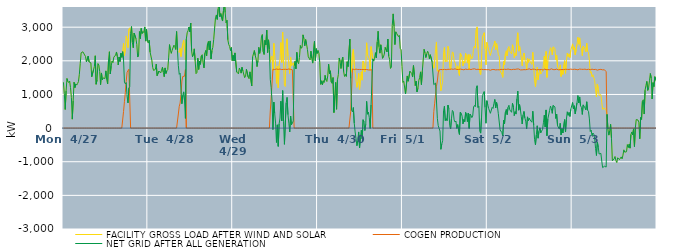
| Category | FACILITY GROSS LOAD AFTER WIND AND SOLAR | COGEN PRODUCTION | NET GRID AFTER ALL GENERATION |
|---|---|---|---|
|  Mon  4/27 | 1361 | 0 | 1361 |
|  Mon  4/27 | 1023 | 0 | 1023 |
|  Mon  4/27 | 554 | 0 | 554 |
|  Mon  4/27 | 1106 | 0 | 1106 |
|  Mon  4/27 | 1473 | 0 | 1473 |
|  Mon  4/27 | 1386 | 0 | 1386 |
|  Mon  4/27 | 1354 | 0 | 1354 |
|  Mon  4/27 | 1400 | 0 | 1400 |
|  Mon  4/27 | 1206 | 0 | 1206 |
|  Mon  4/27 | 909 | 0 | 909 |
|  Mon  4/27 | 266 | 0 | 266 |
|  Mon  4/27 | 810 | 0 | 810 |
|  Mon  4/27 | 1363 | 0 | 1363 |
|  Mon  4/27 | 1203 | 0 | 1203 |
|  Mon  4/27 | 1314 | 0 | 1314 |
|  Mon  4/27 | 1278 | 0 | 1278 |
|  Mon  4/27 | 1325 | 0 | 1325 |
|  Mon  4/27 | 1386 | 0 | 1386 |
|  Mon  4/27 | 1600 | 0 | 1600 |
|  Mon  4/27 | 1918 | 0 | 1918 |
|  Mon  4/27 | 2237 | 0 | 2237 |
|  Mon  4/27 | 2208 | 0 | 2208 |
|  Mon  4/27 | 2268 | 0 | 2268 |
|  Mon  4/27 | 2263 | 0 | 2263 |
|  Mon  4/27 | 2173 | 0 | 2173 |
|  Mon  4/27 | 2127 | 0 | 2127 |
|  Mon  4/27 | 1969 | 0 | 1969 |
|  Mon  4/27 | 1982 | 0 | 1982 |
|  Mon  4/27 | 2140 | 0 | 2140 |
|  Mon  4/27 | 1966 | 0 | 1966 |
|  Mon  4/27 | 1949 | 0 | 1949 |
|  Mon  4/27 | 1941 | 0 | 1941 |
|  Mon  4/27 | 1524 | 0 | 1524 |
|  Mon  4/27 | 1505 | 0 | 1505 |
|  Mon  4/27 | 1728 | 0 | 1728 |
|  Mon  4/27 | 1834 | 0 | 1834 |
|  Mon  4/27 | 2150 | 0 | 2150 |
|  Mon  4/27 | 1303 | 0 | 1303 |
|  Mon  4/27 | 1428 | 0 | 1428 |
|  Mon  4/27 | 1918 | 0 | 1918 |
|  Mon  4/27 | 1874 | 0 | 1874 |
|  Mon  4/27 | 1685 | 0 | 1685 |
|  Mon  4/27 | 1290 | 0 | 1290 |
|  Mon  4/27 | 1639 | 0 | 1639 |
|  Mon  4/27 | 1435 | 0 | 1435 |
|  Mon  4/27 | 1491 | 0 | 1491 |
|  Mon  4/27 | 1464 | 0 | 1464 |
|  Mon  4/27 | 1474 | 0 | 1474 |
|  Mon  4/27 | 1701 | 0 | 1701 |
|  Mon  4/27 | 1441 | 0 | 1441 |
|  Mon  4/27 | 1311 | 0 | 1311 |
|  Mon  4/27 | 2016 | 0 | 2016 |
|  Mon  4/27 | 2270 | 0 | 2270 |
|  Mon  4/27 | 1611 | 0 | 1611 |
|  Mon  4/27 | 1842 | 0 | 1842 |
|  Mon  4/27 | 1997 | 0 | 1997 |
|  Mon  4/27 | 1945 | 0 | 1945 |
|  Mon  4/27 | 2108 | 0 | 2108 |
|  Mon  4/27 | 2132 | 0 | 2132 |
|  Mon  4/27 | 2171 | 0 | 2171 |
|  Mon  4/27 | 2263 | 0 | 2263 |
|  Mon  4/27 | 2124 | 0 | 2124 |
|  Mon  4/27 | 1877 | 0 | 1877 |
|  Mon  4/27 | 2114 | 0 | 2114 |
|  Mon  4/27 | 1979 | 0 | 1979 |
|  Mon  4/27 | 2227 | 0 | 2227 |
|  Mon  4/27 | 2104 | 0 | 2104 |
|  Mon  4/27 | 2271 | 0 | 2271 |
|  Mon  4/27 | 2520 | 494 | 2026 |
|  Mon  4/27 | 2155 | 784 | 1371 |
|  Mon  4/27 | 2367 | 1052 | 1315 |
|  Mon  4/27 | 2740 | 1388 | 1352 |
|  Mon  4/27 | 2609 | 1658 | 951 |
|  Mon  4/27 | 2392 | 1642 | 750 |
|  Mon  4/27 | 2936 | 1749 | 1187 |
|  Mon  4/27 | 2981 | 1747 | 1234 |
|  Mon  4/27 | 2820 | 0 | 2820 |
|  Mon  4/27 | 3019 | 0 | 3019 |
|  Mon  4/27 | 2544 | 0 | 2544 |
|  Mon  4/27 | 2389 | 0 | 2389 |
|  Mon  4/27 | 2825 | 0 | 2825 |
|  Mon  4/27 | 2824 | 0 | 2824 |
|  Mon  4/27 | 2659 | 0 | 2659 |
|  Mon  4/27 | 2485 | 0 | 2485 |
|  Mon  4/27 | 2113 | 0 | 2113 |
|  Mon  4/27 | 2169 | 0 | 2169 |
|  Mon  4/27 | 2870 | 0 | 2870 |
|  Mon  4/27 | 2660 | 0 | 2660 |
|  Mon  4/27 | 2964 | 0 | 2964 |
|  Mon  4/27 | 2810 | 0 | 2810 |
|  Mon  4/27 | 2870 | 0 | 2870 |
|  Mon  4/27 | 2840 | 0 | 2840 |
|  Mon  4/27 | 3007 | 0 | 3007 |
|  Mon  4/27 | 2586 | 0 | 2586 |
|  Mon  4/27 | 2938 | 0 | 2938 |
|  Mon  4/27 | 2580 | 0 | 2580 |
|  Tue  4/28 | 2531 | 0 | 2531 |
|  Tue  4/28 | 2614 | 0 | 2614 |
|  Tue  4/28 | 2262 | 0 | 2262 |
|  Tue  4/28 | 2263 | 0 | 2263 |
|  Tue  4/28 | 2017 | 0 | 2017 |
|  Tue  4/28 | 1799 | 0 | 1799 |
|  Tue  4/28 | 1714 | 0 | 1714 |
|  Tue  4/28 | 1735 | 0 | 1735 |
|  Tue  4/28 | 1745 | 0 | 1745 |
|  Tue  4/28 | 1901 | 0 | 1901 |
|  Tue  4/28 | 1558 | 0 | 1558 |
|  Tue  4/28 | 1535 | 0 | 1535 |
|  Tue  4/28 | 1697 | 0 | 1697 |
|  Tue  4/28 | 1707 | 0 | 1707 |
|  Tue  4/28 | 1638 | 0 | 1638 |
|  Tue  4/28 | 1722 | 0 | 1722 |
|  Tue  4/28 | 1810 | 0 | 1810 |
|  Tue  4/28 | 1660 | 0 | 1660 |
|  Tue  4/28 | 1528 | 0 | 1528 |
|  Tue  4/28 | 1789 | 0 | 1789 |
|  Tue  4/28 | 1623 | 0 | 1623 |
|  Tue  4/28 | 1706 | 0 | 1706 |
|  Tue  4/28 | 1740 | 0 | 1740 |
|  Tue  4/28 | 2086 | 0 | 2086 |
|  Tue  4/28 | 2481 | 0 | 2481 |
|  Tue  4/28 | 2316 | 0 | 2316 |
|  Tue  4/28 | 2221 | 0 | 2221 |
|  Tue  4/28 | 2317 | 0 | 2317 |
|  Tue  4/28 | 2310 | 0 | 2310 |
|  Tue  4/28 | 2465 | 0 | 2465 |
|  Tue  4/28 | 2420 | 0 | 2420 |
|  Tue  4/28 | 2338 | 0 | 2338 |
|  Tue  4/28 | 2870 | 0 | 2870 |
|  Tue  4/28 | 2309 | 0 | 2309 |
|  Tue  4/28 | 2276 | 419 | 1857 |
|  Tue  4/28 | 2246 | 647 | 1599 |
|  Tue  4/28 | 2372 | 742 | 1630 |
|  Tue  4/28 | 2126 | 997 | 1129 |
|  Tue  4/28 | 2122 | 1399 | 723 |
|  Tue  4/28 | 2510 | 1534 | 976 |
|  Tue  4/28 | 2614 | 1537 | 1077 |
|  Tue  4/28 | 2356 | 1544 | 812 |
|  Tue  4/28 | 2028 | 1739 | 289 |
|  Tue  4/28 | 2643 | 0 | 2643 |
|  Tue  4/28 | 2834 | 0 | 2834 |
|  Tue  4/28 | 2895 | 0 | 2895 |
|  Tue  4/28 | 3005 | 0 | 3005 |
|  Tue  4/28 | 2859 | 0 | 2859 |
|  Tue  4/28 | 3123 | 0 | 3123 |
|  Tue  4/28 | 2298 | 0 | 2298 |
|  Tue  4/28 | 2121 | 0 | 2121 |
|  Tue  4/28 | 2200 | 0 | 2200 |
|  Tue  4/28 | 2356 | 0 | 2356 |
|  Tue  4/28 | 2010 | 0 | 2010 |
|  Tue  4/28 | 1619 | 0 | 1619 |
|  Tue  4/28 | 1654 | 0 | 1654 |
|  Tue  4/28 | 2079 | 0 | 2079 |
|  Tue  4/28 | 1743 | 0 | 1743 |
|  Tue  4/28 | 1989 | 0 | 1989 |
|  Tue  4/28 | 1896 | 0 | 1896 |
|  Tue  4/28 | 2145 | 0 | 2145 |
|  Tue  4/28 | 2182 | 0 | 2182 |
|  Tue  4/28 | 1942 | 0 | 1942 |
|  Tue  4/28 | 1790 | 0 | 1790 |
|  Tue  4/28 | 2224 | 0 | 2224 |
|  Tue  4/28 | 2307 | 0 | 2307 |
|  Tue  4/28 | 2151 | 0 | 2151 |
|  Tue  4/28 | 2503 | 0 | 2503 |
|  Tue  4/28 | 2577 | 0 | 2577 |
|  Tue  4/28 | 2323 | 0 | 2323 |
|  Tue  4/28 | 2591 | 0 | 2591 |
|  Tue  4/28 | 2057 | 0 | 2057 |
|  Tue  4/28 | 2301 | 0 | 2301 |
|  Tue  4/28 | 2400 | 0 | 2400 |
|  Tue  4/28 | 2639 | 0 | 2639 |
|  Tue  4/28 | 2645 | 0 | 2645 |
|  Tue  4/28 | 3277 | 0 | 3277 |
|  Tue  4/28 | 3364 | 0 | 3364 |
|  Tue  4/28 | 3231 | 0 | 3231 |
|  Tue  4/28 | 3536 | 0 | 3536 |
|  Tue  4/28 | 3761 | 0 | 3761 |
|  Tue  4/28 | 3311 | 0 | 3311 |
|  Tue  4/28 | 3404 | 0 | 3404 |
|  Tue  4/28 | 3402 | 0 | 3402 |
|  Tue  4/28 | 3183 | 0 | 3183 |
|  Tue  4/28 | 3483 | 0 | 3483 |
|  Tue  4/28 | 3815 | 0 | 3815 |
|  Tue  4/28 | 3434 | 0 | 3434 |
|  Tue  4/28 | 3133 | 0 | 3133 |
|  Tue  4/28 | 3203 | 0 | 3203 |
|  Tue  4/28 | 2625 | 0 | 2625 |
|  Tue  4/28 | 2484 | 0 | 2484 |
|  Tue  4/28 | 2431 | 0 | 2431 |
|  Tue  4/28 | 2305 | 0 | 2305 |
|  Tue  4/28 | 2394 | 0 | 2394 |
|  Tue  4/28 | 2009 | 0 | 2009 |
|  Wed  4/29 | 2164 | 0 | 2164 |
|  Wed  4/29 | 1997 | 0 | 1997 |
|  Wed  4/29 | 2235 | 0 | 2235 |
|  Wed  4/29 | 2218 | 0 | 2218 |
|  Wed  4/29 | 1667 | 0 | 1667 |
|  Wed  4/29 | 1671 | 0 | 1671 |
|  Wed  4/29 | 1613 | 0 | 1613 |
|  Wed  4/29 | 1783 | 0 | 1783 |
|  Wed  4/29 | 1735 | 0 | 1735 |
|  Wed  4/29 | 1634 | 0 | 1634 |
|  Wed  4/29 | 1808 | 0 | 1808 |
|  Wed  4/29 | 1701 | 0 | 1701 |
|  Wed  4/29 | 1710 | 0 | 1710 |
|  Wed  4/29 | 1500 | 0 | 1500 |
|  Wed  4/29 | 1533 | 0 | 1533 |
|  Wed  4/29 | 1747 | 0 | 1747 |
|  Wed  4/29 | 1760 | 0 | 1760 |
|  Wed  4/29 | 1517 | 0 | 1517 |
|  Wed  4/29 | 1469 | 0 | 1469 |
|  Wed  4/29 | 1672 | 0 | 1672 |
|  Wed  4/29 | 1669 | 0 | 1669 |
|  Wed  4/29 | 1255 | 0 | 1255 |
|  Wed  4/29 | 2115 | 0 | 2115 |
|  Wed  4/29 | 2108 | 0 | 2108 |
|  Wed  4/29 | 2305 | 0 | 2305 |
|  Wed  4/29 | 2157 | 0 | 2157 |
|  Wed  4/29 | 2053 | 0 | 2053 |
|  Wed  4/29 | 1829 | 0 | 1829 |
|  Wed  4/29 | 1999 | 0 | 1999 |
|  Wed  4/29 | 2401 | 0 | 2401 |
|  Wed  4/29 | 2222 | 0 | 2222 |
|  Wed  4/29 | 2373 | 0 | 2373 |
|  Wed  4/29 | 2708 | 0 | 2708 |
|  Wed  4/29 | 2779 | 0 | 2779 |
|  Wed  4/29 | 2271 | 0 | 2271 |
|  Wed  4/29 | 2189 | 0 | 2189 |
|  Wed  4/29 | 2609 | 0 | 2609 |
|  Wed  4/29 | 2477 | 0 | 2477 |
|  Wed  4/29 | 2912 | 0 | 2912 |
|  Wed  4/29 | 2246 | 0 | 2246 |
|  Wed  4/29 | 2624 | 0 | 2624 |
|  Wed  4/29 | 2344 | 0 | 2344 |
|  Wed  4/29 | 1954 | 508 | 1446 |
|  Wed  4/29 | 2097 | 894 | 1203 |
|  Wed  4/29 | 2145 | 1338 | 807 |
|  Wed  4/29 | 1706 | 1749 | -43 |
|  Wed  4/29 | 2517 | 1744 | 773 |
|  Wed  4/29 | 2175 | 1741 | 434 |
|  Wed  4/29 | 1904 | 1755 | 149 |
|  Wed  4/29 | 1330 | 1757 | -427 |
|  Wed  4/29 | 1839 | 1742 | 97 |
|  Wed  4/29 | 1200 | 1744 | -544 |
|  Wed  4/29 | 1864 | 1740 | 124 |
|  Wed  4/29 | 2056 | 1756 | 300 |
|  Wed  4/29 | 2542 | 1742 | 800 |
|  Wed  4/29 | 1951 | 1739 | 212 |
|  Wed  4/29 | 2852 | 1737 | 1115 |
|  Wed  4/29 | 1944 | 1746 | 198 |
|  Wed  4/29 | 1269 | 1752 | -483 |
|  Wed  4/29 | 1236 | 1748 | -512 |
|  Wed  4/29 | 2489 | 1738 | 751 |
|  Wed  4/29 | 2655 | 1743 | 912 |
|  Wed  4/29 | 2136 | 1739 | 397 |
|  Wed  4/29 | 1903 | 1757 | 146 |
|  Wed  4/29 | 1620 | 1735 | -115 |
|  Wed  4/29 | 2103 | 1745 | 358 |
|  Wed  4/29 | 1848 | 1748 | 100 |
|  Wed  4/29 | 1876 | 1734 | 142 |
|  Wed  4/29 | 1943 | 1728 | 215 |
|  Wed  4/29 | 1833 | 0 | 1833 |
|  Wed  4/29 | 1984 | 0 | 1984 |
|  Wed  4/29 | 1762 | 0 | 1762 |
|  Wed  4/29 | 2251 | 0 | 2251 |
|  Wed  4/29 | 1971 | 0 | 1971 |
|  Wed  4/29 | 1913 | 0 | 1913 |
|  Wed  4/29 | 2099 | 0 | 2099 |
|  Wed  4/29 | 2454 | 0 | 2454 |
|  Wed  4/29 | 2374 | 0 | 2374 |
|  Wed  4/29 | 2404 | 0 | 2404 |
|  Wed  4/29 | 2772 | 0 | 2772 |
|  Wed  4/29 | 2661 | 0 | 2661 |
|  Wed  4/29 | 2446 | 0 | 2446 |
|  Wed  4/29 | 2631 | 0 | 2631 |
|  Wed  4/29 | 2502 | 0 | 2502 |
|  Wed  4/29 | 2341 | 0 | 2341 |
|  Wed  4/29 | 2119 | 0 | 2119 |
|  Wed  4/29 | 2074 | 0 | 2074 |
|  Wed  4/29 | 2029 | 0 | 2029 |
|  Wed  4/29 | 2286 | 0 | 2286 |
|  Wed  4/29 | 2072 | 0 | 2072 |
|  Wed  4/29 | 1932 | 0 | 1932 |
|  Wed  4/29 | 1929 | 0 | 1929 |
|  Wed  4/29 | 2578 | 0 | 2578 |
|  Wed  4/29 | 2004 | 0 | 2004 |
|  Wed  4/29 | 2362 | 0 | 2362 |
|  Wed  4/29 | 2219 | 0 | 2219 |
|  Thu  4/30 | 2305 | 0 | 2305 |
|  Thu  4/30 | 2226 | 0 | 2226 |
|  Thu  4/30 | 1942 | 0 | 1942 |
|  Thu  4/30 | 1301 | 0 | 1301 |
|  Thu  4/30 | 1405 | 0 | 1405 |
|  Thu  4/30 | 1288 | 0 | 1288 |
|  Thu  4/30 | 1407 | 0 | 1407 |
|  Thu  4/30 | 1358 | 0 | 1358 |
|  Thu  4/30 | 1568 | 0 | 1568 |
|  Thu  4/30 | 1429 | 0 | 1429 |
|  Thu  4/30 | 1386 | 0 | 1386 |
|  Thu  4/30 | 1550 | 0 | 1550 |
|  Thu  4/30 | 1901 | 0 | 1901 |
|  Thu  4/30 | 1611 | 0 | 1611 |
|  Thu  4/30 | 1703 | 0 | 1703 |
|  Thu  4/30 | 1367 | 0 | 1367 |
|  Thu  4/30 | 1327 | 0 | 1327 |
|  Thu  4/30 | 1504 | 0 | 1504 |
|  Thu  4/30 | 462 | 0 | 462 |
|  Thu  4/30 | 978 | 0 | 978 |
|  Thu  4/30 | 1358 | 0 | 1358 |
|  Thu  4/30 | 560 | 0 | 560 |
|  Thu  4/30 | 1444 | 0 | 1444 |
|  Thu  4/30 | 1591 | 0 | 1591 |
|  Thu  4/30 | 2084 | 0 | 2084 |
|  Thu  4/30 | 1979 | 0 | 1979 |
|  Thu  4/30 | 1772 | 0 | 1772 |
|  Thu  4/30 | 2015 | 0 | 2015 |
|  Thu  4/30 | 2112 | 0 | 2112 |
|  Thu  4/30 | 1677 | 0 | 1677 |
|  Thu  4/30 | 1535 | 0 | 1535 |
|  Thu  4/30 | 1598 | 0 | 1598 |
|  Thu  4/30 | 1537 | 0 | 1537 |
|  Thu  4/30 | 1971 | 0 | 1971 |
|  Thu  4/30 | 1829 | 0 | 1829 |
|  Thu  4/30 | 1826 | 0 | 1826 |
|  Thu  4/30 | 2645 | 0 | 2645 |
|  Thu  4/30 | 1970 | 499 | 1471 |
|  Thu  4/30 | 1664 | 1132 | 532 |
|  Thu  4/30 | 2243 | 1760 | 483 |
|  Thu  4/30 | 2347 | 1736 | 611 |
|  Thu  4/30 | 1883 | 1739 | 144 |
|  Thu  4/30 | 1638 | 1751 | -113 |
|  Thu  4/30 | 1658 | 1754 | -96 |
|  Thu  4/30 | 1211 | 1735 | -524 |
|  Thu  4/30 | 1369 | 1742 | -373 |
|  Thu  4/30 | 1625 | 1739 | -114 |
|  Thu  4/30 | 1152 | 1743 | -591 |
|  Thu  4/30 | 1472 | 1746 | -274 |
|  Thu  4/30 | 1675 | 1741 | -66 |
|  Thu  4/30 | 1424 | 1743 | -319 |
|  Thu  4/30 | 1989 | 1741 | 248 |
|  Thu  4/30 | 1900 | 1714 | 186 |
|  Thu  4/30 | 1669 | 1741 | -72 |
|  Thu  4/30 | 1853 | 1738 | 115 |
|  Thu  4/30 | 2536 | 1742 | 794 |
|  Thu  4/30 | 2173 | 1760 | 413 |
|  Thu  4/30 | 2201 | 1730 | 471 |
|  Thu  4/30 | 2061 | 1753 | 308 |
|  Thu  4/30 | 1718 | 1728 | -10 |
|  Thu  4/30 | 2422 | 1733 | 689 |
|  Thu  4/30 | 2404 | 1734 | 670 |
|  Thu  4/30 | 2059 | 0 | 2059 |
|  Thu  4/30 | 1991 | 0 | 1991 |
|  Thu  4/30 | 2073 | 0 | 2073 |
|  Thu  4/30 | 2242 | 0 | 2242 |
|  Thu  4/30 | 2089 | 0 | 2089 |
|  Thu  4/30 | 2564 | 0 | 2564 |
|  Thu  4/30 | 2879 | 0 | 2879 |
|  Thu  4/30 | 2416 | 0 | 2416 |
|  Thu  4/30 | 2228 | 0 | 2228 |
|  Thu  4/30 | 2476 | 0 | 2476 |
|  Thu  4/30 | 2312 | 0 | 2312 |
|  Thu  4/30 | 2072 | 0 | 2072 |
|  Thu  4/30 | 2116 | 0 | 2116 |
|  Thu  4/30 | 2199 | 0 | 2199 |
|  Thu  4/30 | 2399 | 0 | 2399 |
|  Thu  4/30 | 2401 | 0 | 2401 |
|  Thu  4/30 | 2269 | 0 | 2269 |
|  Thu  4/30 | 2646 | 0 | 2646 |
|  Thu  4/30 | 2137 | 0 | 2137 |
|  Thu  4/30 | 2044 | 0 | 2044 |
|  Thu  4/30 | 1773 | 0 | 1773 |
|  Thu  4/30 | 1815 | 0 | 1815 |
|  Thu  4/30 | 3052 | 0 | 3052 |
|  Thu  4/30 | 3395 | 0 | 3395 |
|  Thu  4/30 | 3036 | 0 | 3036 |
|  Thu  4/30 | 2483 | 0 | 2483 |
|  Thu  4/30 | 2862 | 0 | 2862 |
|  Thu  4/30 | 2813 | 0 | 2813 |
|  Thu  4/30 | 2833 | 0 | 2833 |
|  Thu  4/30 | 2720 | 0 | 2720 |
|  Thu  4/30 | 2756 | 0 | 2756 |
|  Thu  4/30 | 2370 | 0 | 2370 |
|  Thu  4/30 | 2327 | 0 | 2327 |
|  Thu  4/30 | 1832 | 0 | 1832 |
|  Fri  5/1 | 1360 | 0 | 1360 |
|  Fri  5/1 | 1393 | 0 | 1393 |
|  Fri  5/1 | 1415 | 0 | 1415 |
|  Fri  5/1 | 1017 | 0 | 1017 |
|  Fri  5/1 | 995 | 0 | 995 |
|  Fri  5/1 | 1550 | 0 | 1550 |
|  Fri  5/1 | 1393 | 0 | 1393 |
|  Fri  5/1 | 1417 | 0 | 1417 |
|  Fri  5/1 | 1689 | 0 | 1689 |
|  Fri  5/1 | 1659 | 0 | 1659 |
|  Fri  5/1 | 1623 | 0 | 1623 |
|  Fri  5/1 | 1518 | 0 | 1518 |
|  Fri  5/1 | 1859 | 0 | 1859 |
|  Fri  5/1 | 1583 | 0 | 1583 |
|  Fri  5/1 | 1264 | 0 | 1264 |
|  Fri  5/1 | 1395 | 0 | 1395 |
|  Fri  5/1 | 1077 | 0 | 1077 |
|  Fri  5/1 | 1179 | 0 | 1179 |
|  Fri  5/1 | 1415 | 0 | 1415 |
|  Fri  5/1 | 1502 | 0 | 1502 |
|  Fri  5/1 | 1671 | 0 | 1671 |
|  Fri  5/1 | 1293 | 0 | 1293 |
|  Fri  5/1 | 1689 | 0 | 1689 |
|  Fri  5/1 | 2023 | 0 | 2023 |
|  Fri  5/1 | 2341 | 0 | 2341 |
|  Fri  5/1 | 2236 | 0 | 2236 |
|  Fri  5/1 | 2098 | 0 | 2098 |
|  Fri  5/1 | 2205 | 0 | 2205 |
|  Fri  5/1 | 2284 | 0 | 2284 |
|  Fri  5/1 | 2223 | 0 | 2223 |
|  Fri  5/1 | 2062 | 0 | 2062 |
|  Fri  5/1 | 2180 | 0 | 2180 |
|  Fri  5/1 | 2181 | 0 | 2181 |
|  Fri  5/1 | 1973 | 0 | 1973 |
|  Fri  5/1 | 1995 | 0 | 1995 |
|  Fri  5/1 | 1782 | 490 | 1292 |
|  Fri  5/1 | 2040 | 740 | 1300 |
|  Fri  5/1 | 2334 | 996 | 1338 |
|  Fri  5/1 | 2560 | 1245 | 1315 |
|  Fri  5/1 | 1691 | 1401 | 290 |
|  Fri  5/1 | 1714 | 1640 | 74 |
|  Fri  5/1 | 1721 | 1731 | -10 |
|  Fri  5/1 | 1652 | 1740 | -88 |
|  Fri  5/1 | 1112 | 1743 | -631 |
|  Fri  5/1 | 1261 | 1738 | -477 |
|  Fri  5/1 | 1365 | 1738 | -373 |
|  Fri  5/1 | 2250 | 1739 | 511 |
|  Fri  5/1 | 2395 | 1746 | 649 |
|  Fri  5/1 | 1964 | 1740 | 224 |
|  Fri  5/1 | 2016 | 1737 | 279 |
|  Fri  5/1 | 1972 | 1752 | 220 |
|  Fri  5/1 | 2432 | 1748 | 684 |
|  Fri  5/1 | 2327 | 1747 | 580 |
|  Fri  5/1 | 1816 | 1746 | 70 |
|  Fri  5/1 | 1728 | 1754 | -26 |
|  Fri  5/1 | 2044 | 1756 | 288 |
|  Fri  5/1 | 2266 | 1741 | 525 |
|  Fri  5/1 | 2236 | 1747 | 489 |
|  Fri  5/1 | 1994 | 1751 | 243 |
|  Fri  5/1 | 1941 | 1761 | 180 |
|  Fri  5/1 | 1945 | 1735 | 210 |
|  Fri  5/1 | 1734 | 1743 | -9 |
|  Fri  5/1 | 1850 | 1747 | 103 |
|  Fri  5/1 | 1846 | 1742 | 104 |
|  Fri  5/1 | 1565 | 1754 | -189 |
|  Fri  5/1 | 2228 | 1754 | 474 |
|  Fri  5/1 | 2186 | 1742 | 444 |
|  Fri  5/1 | 2096 | 1743 | 353 |
|  Fri  5/1 | 1849 | 1723 | 126 |
|  Fri  5/1 | 1992 | 1733 | 259 |
|  Fri  5/1 | 1930 | 1744 | 186 |
|  Fri  5/1 | 2218 | 1754 | 464 |
|  Fri  5/1 | 2131 | 1737 | 394 |
|  Fri  5/1 | 1933 | 1741 | 192 |
|  Fri  5/1 | 2183 | 1738 | 445 |
|  Fri  5/1 | 1743 | 1754 | -11 |
|  Fri  5/1 | 2184 | 1765 | 419 |
|  Fri  5/1 | 2121 | 1740 | 381 |
|  Fri  5/1 | 2061 | 1750 | 311 |
|  Fri  5/1 | 2116 | 1756 | 360 |
|  Fri  5/1 | 2372 | 1745 | 627 |
|  Fri  5/1 | 2436 | 1763 | 673 |
|  Fri  5/1 | 2376 | 1740 | 636 |
|  Fri  5/1 | 2917 | 1742 | 1175 |
|  Fri  5/1 | 3009 | 1750 | 1259 |
|  Fri  5/1 | 2363 | 1750 | 613 |
|  Fri  5/1 | 2378 | 1731 | 647 |
|  Fri  5/1 | 1649 | 1740 | -91 |
|  Fri  5/1 | 1590 | 1740 | -150 |
|  Fri  5/1 | 2071 | 1749 | 322 |
|  Fri  5/1 | 2711 | 1743 | 968 |
|  Fri  5/1 | 2699 | 1739 | 960 |
|  Fri  5/1 | 2836 | 1751 | 1085 |
|  Fri  5/1 | 2354 | 1741 | 613 |
|  Fri  5/1 | 1879 | 1735 | 144 |
|  Fri  5/1 | 2549 | 1735 | 814 |
|  Sat  5/2 | 2442 | 1746 | 696 |
|  Sat  5/2 | 2326 | 1739 | 587 |
|  Sat  5/2 | 2321 | 1740 | 581 |
|  Sat  5/2 | 2159 | 1720 | 439 |
|  Sat  5/2 | 2180 | 1746 | 434 |
|  Sat  5/2 | 2357 | 1741 | 616 |
|  Sat  5/2 | 2349 | 1764 | 585 |
|  Sat  5/2 | 2474 | 1742 | 732 |
|  Sat  5/2 | 2590 | 1739 | 851 |
|  Sat  5/2 | 2329 | 1730 | 599 |
|  Sat  5/2 | 2512 | 1748 | 764 |
|  Sat  5/2 | 2370 | 1735 | 635 |
|  Sat  5/2 | 2178 | 1751 | 427 |
|  Sat  5/2 | 2136 | 1733 | 403 |
|  Sat  5/2 | 1703 | 1759 | -56 |
|  Sat  5/2 | 1703 | 1747 | -44 |
|  Sat  5/2 | 1605 | 1738 | -133 |
|  Sat  5/2 | 1508 | 1741 | -233 |
|  Sat  5/2 | 1983 | 1751 | 232 |
|  Sat  5/2 | 1875 | 1748 | 127 |
|  Sat  5/2 | 2218 | 1743 | 475 |
|  Sat  5/2 | 2298 | 1744 | 554 |
|  Sat  5/2 | 2144 | 1744 | 400 |
|  Sat  5/2 | 2370 | 1755 | 615 |
|  Sat  5/2 | 2426 | 1747 | 679 |
|  Sat  5/2 | 2282 | 1742 | 540 |
|  Sat  5/2 | 2281 | 1752 | 529 |
|  Sat  5/2 | 2207 | 1737 | 470 |
|  Sat  5/2 | 2478 | 1740 | 738 |
|  Sat  5/2 | 2374 | 1748 | 626 |
|  Sat  5/2 | 2092 | 1721 | 371 |
|  Sat  5/2 | 2234 | 1744 | 490 |
|  Sat  5/2 | 2151 | 1735 | 416 |
|  Sat  5/2 | 2620 | 1756 | 864 |
|  Sat  5/2 | 2834 | 1734 | 1100 |
|  Sat  5/2 | 2289 | 1757 | 532 |
|  Sat  5/2 | 2442 | 1744 | 698 |
|  Sat  5/2 | 2268 | 1731 | 537 |
|  Sat  5/2 | 2077 | 1742 | 335 |
|  Sat  5/2 | 1855 | 1732 | 123 |
|  Sat  5/2 | 2128 | 1741 | 387 |
|  Sat  5/2 | 2233 | 1738 | 495 |
|  Sat  5/2 | 2038 | 1736 | 302 |
|  Sat  5/2 | 1944 | 1736 | 208 |
|  Sat  5/2 | 1727 | 1746 | -19 |
|  Sat  5/2 | 2079 | 1746 | 333 |
|  Sat  5/2 | 1949 | 1732 | 217 |
|  Sat  5/2 | 2057 | 1762 | 295 |
|  Sat  5/2 | 1978 | 1738 | 240 |
|  Sat  5/2 | 1991 | 1736 | 255 |
|  Sat  5/2 | 1893 | 1720 | 173 |
|  Sat  5/2 | 2253 | 1752 | 501 |
|  Sat  5/2 | 1830 | 1738 | 92 |
|  Sat  5/2 | 1403 | 1748 | -345 |
|  Sat  5/2 | 1232 | 1734 | -502 |
|  Sat  5/2 | 1529 | 1731 | -202 |
|  Sat  5/2 | 1813 | 1744 | 69 |
|  Sat  5/2 | 1439 | 1739 | -300 |
|  Sat  5/2 | 1638 | 1731 | -93 |
|  Sat  5/2 | 1744 | 1736 | 8 |
|  Sat  5/2 | 1606 | 1748 | -142 |
|  Sat  5/2 | 1658 | 1742 | -84 |
|  Sat  5/2 | 1696 | 1739 | -43 |
|  Sat  5/2 | 1882 | 1724 | 158 |
|  Sat  5/2 | 2138 | 1756 | 382 |
|  Sat  5/2 | 1767 | 1733 | 34 |
|  Sat  5/2 | 2278 | 1738 | 540 |
|  Sat  5/2 | 1507 | 1734 | -227 |
|  Sat  5/2 | 2012 | 1738 | 274 |
|  Sat  5/2 | 2010 | 1754 | 256 |
|  Sat  5/2 | 2259 | 1736 | 523 |
|  Sat  5/2 | 2390 | 1735 | 655 |
|  Sat  5/2 | 2341 | 1763 | 578 |
|  Sat  5/2 | 2175 | 1736 | 439 |
|  Sat  5/2 | 2414 | 1740 | 674 |
|  Sat  5/2 | 2405 | 1747 | 658 |
|  Sat  5/2 | 2368 | 1738 | 630 |
|  Sat  5/2 | 2026 | 1740 | 286 |
|  Sat  5/2 | 2165 | 1754 | 411 |
|  Sat  5/2 | 1820 | 1750 | 70 |
|  Sat  5/2 | 1780 | 1733 | 47 |
|  Sat  5/2 | 1720 | 1750 | -30 |
|  Sat  5/2 | 1879 | 1737 | 142 |
|  Sat  5/2 | 1536 | 1737 | -201 |
|  Sat  5/2 | 1733 | 1741 | -8 |
|  Sat  5/2 | 1596 | 1742 | -146 |
|  Sat  5/2 | 1568 | 1740 | -172 |
|  Sat  5/2 | 2005 | 1753 | 252 |
|  Sat  5/2 | 1631 | 1748 | -117 |
|  Sat  5/2 | 1995 | 1734 | 261 |
|  Sat  5/2 | 2230 | 1746 | 484 |
|  Sat  5/2 | 2125 | 1746 | 379 |
|  Sat  5/2 | 2209 | 1743 | 466 |
|  Sat  5/2 | 2097 | 1750 | 347 |
|  Sat  5/2 | 2314 | 1754 | 560 |
|  Sat  5/2 | 2292 | 1752 | 540 |
|  Sun  5/3 | 2504 | 1743 | 761 |
|  Sun  5/3 | 2324 | 1753 | 571 |
|  Sun  5/3 | 2414 | 1750 | 664 |
|  Sun  5/3 | 2176 | 1754 | 422 |
|  Sun  5/3 | 2172 | 1744 | 428 |
|  Sun  5/3 | 2486 | 1735 | 751 |
|  Sun  5/3 | 2700 | 1733 | 967 |
|  Sun  5/3 | 2493 | 1746 | 747 |
|  Sun  5/3 | 2681 | 1755 | 926 |
|  Sun  5/3 | 2400 | 1736 | 664 |
|  Sun  5/3 | 2365 | 1748 | 617 |
|  Sun  5/3 | 2156 | 1750 | 406 |
|  Sun  5/3 | 2437 | 1746 | 691 |
|  Sun  5/3 | 2403 | 1734 | 669 |
|  Sun  5/3 | 2354 | 1752 | 602 |
|  Sun  5/3 | 2269 | 1728 | 541 |
|  Sun  5/3 | 2521 | 1739 | 782 |
|  Sun  5/3 | 2283 | 1750 | 533 |
|  Sun  5/3 | 2247 | 1750 | 497 |
|  Sun  5/3 | 2021 | 1748 | 273 |
|  Sun  5/3 | 1634 | 1736 | -102 |
|  Sun  5/3 | 1678 | 1737 | -59 |
|  Sun  5/3 | 1522 | 1752 | -230 |
|  Sun  5/3 | 1587 | 1736 | -149 |
|  Sun  5/3 | 1559 | 1740 | -181 |
|  Sun  5/3 | 1414 | 1725 | -311 |
|  Sun  5/3 | 1142 | 1745 | -603 |
|  Sun  5/3 | 927 | 1741 | -814 |
|  Sun  5/3 | 1311 | 1723 | -412 |
|  Sun  5/3 | 1184 | 1745 | -561 |
|  Sun  5/3 | 968 | 1739 | -771 |
|  Sun  5/3 | 947 | 1726 | -779 |
|  Sun  5/3 | 995 | 1746 | -751 |
|  Sun  5/3 | 756 | 1736 | -980 |
|  Sun  5/3 | 556 | 1731 | -1175 |
|  Sun  5/3 | 571 | 1729 | -1158 |
|  Sun  5/3 | 600 | 1734 | -1134 |
|  Sun  5/3 | 619 | 1740 | -1121 |
|  Sun  5/3 | 518 | 1676 | -1158 |
|  Sun  5/3 | 407 | 0 | 407 |
|  Sun  5/3 | -33 | 0 | -33 |
|  Sun  5/3 | -209 | 0 | -209 |
|  Sun  5/3 | -78 | 0 | -78 |
|  Sun  5/3 | 112 | 0 | 112 |
|  Sun  5/3 | -299 | 0 | -299 |
|  Sun  5/3 | -971 | 0 | -971 |
|  Sun  5/3 | -970 | 0 | -970 |
|  Sun  5/3 | -916 | 0 | -916 |
|  Sun  5/3 | -845 | 0 | -845 |
|  Sun  5/3 | -965 | 0 | -965 |
|  Sun  5/3 | -1023 | 0 | -1023 |
|  Sun  5/3 | -883 | 0 | -883 |
|  Sun  5/3 | -874 | 0 | -874 |
|  Sun  5/3 | -938 | 0 | -938 |
|  Sun  5/3 | -912 | 0 | -912 |
|  Sun  5/3 | -857 | 0 | -857 |
|  Sun  5/3 | -915 | 0 | -915 |
|  Sun  5/3 | -803 | 0 | -803 |
|  Sun  5/3 | -646 | 0 | -646 |
|  Sun  5/3 | -715 | 0 | -715 |
|  Sun  5/3 | -690 | 0 | -690 |
|  Sun  5/3 | -702 | 0 | -702 |
|  Sun  5/3 | -493 | 0 | -493 |
|  Sun  5/3 | -577 | 0 | -577 |
|  Sun  5/3 | -474 | 0 | -474 |
|  Sun  5/3 | -596 | 0 | -596 |
|  Sun  5/3 | -193 | 0 | -193 |
|  Sun  5/3 | -115 | 0 | -115 |
|  Sun  5/3 | -202 | 0 | -202 |
|  Sun  5/3 | -23 | 0 | -23 |
|  Sun  5/3 | -548 | 0 | -548 |
|  Sun  5/3 | 6 | 0 | 6 |
|  Sun  5/3 | 255 | 0 | 255 |
|  Sun  5/3 | 262 | 0 | 262 |
|  Sun  5/3 | 239 | 0 | 239 |
|  Sun  5/3 | 176 | 0 | 176 |
|  Sun  5/3 | -318 | 0 | -318 |
|  Sun  5/3 | 314 | 0 | 314 |
|  Sun  5/3 | 259 | 0 | 259 |
|  Sun  5/3 | 797 | 0 | 797 |
|  Sun  5/3 | 843 | 0 | 843 |
|  Sun  5/3 | 418 | 0 | 418 |
|  Sun  5/3 | 1126 | 0 | 1126 |
|  Sun  5/3 | 1265 | 0 | 1265 |
|  Sun  5/3 | 1387 | 0 | 1387 |
|  Sun  5/3 | 1122 | 0 | 1122 |
|  Sun  5/3 | 1207 | 0 | 1207 |
|  Sun  5/3 | 1406 | 0 | 1406 |
|  Sun  5/3 | 1622 | 0 | 1622 |
|  Sun  5/3 | 1480 | 0 | 1480 |
|  Sun  5/3 | 865 | 0 | 865 |
|  Sun  5/3 | 1351 | 0 | 1351 |
|  Sun  5/3 | 1234 | 0 | 1234 |
|  Sun  5/3 | 1528 | 0 | 1528 |
|  Sun  5/3 | 1438 | 0 | 1438 |
|  Sun  5/3 | 1372 | 0 | 1372 |